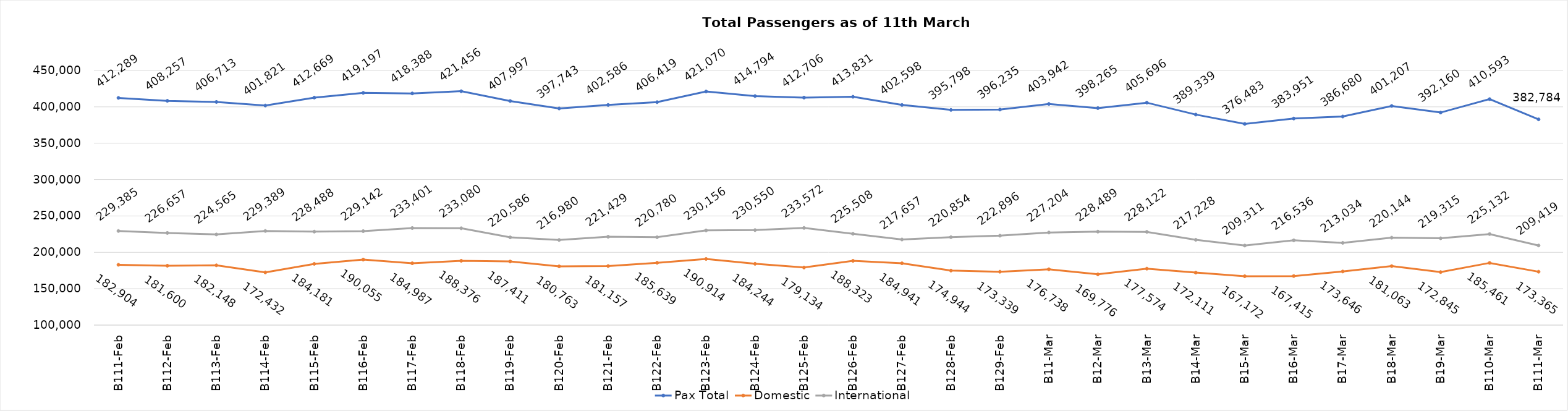
| Category | Pax Total | Domestic | International |
|---|---|---|---|
| 2024-02-11 | 412289 | 182904 | 229385 |
| 2024-02-12 | 408257 | 181600 | 226657 |
| 2024-02-13 | 406713 | 182148 | 224565 |
| 2024-02-14 | 401821 | 172432 | 229389 |
| 2024-02-15 | 412669 | 184181 | 228488 |
| 2024-02-16 | 419197 | 190055 | 229142 |
| 2024-02-17 | 418388 | 184987 | 233401 |
| 2024-02-18 | 421456 | 188376 | 233080 |
| 2024-02-19 | 407997 | 187411 | 220586 |
| 2024-02-20 | 397743 | 180763 | 216980 |
| 2024-02-21 | 402586 | 181157 | 221429 |
| 2024-02-22 | 406419 | 185639 | 220780 |
| 2024-02-23 | 421070 | 190914 | 230156 |
| 2024-02-24 | 414794 | 184244 | 230550 |
| 2024-02-25 | 412706 | 179134 | 233572 |
| 2024-02-26 | 413831 | 188323 | 225508 |
| 2024-02-27 | 402598 | 184941 | 217657 |
| 2024-02-28 | 395798 | 174944 | 220854 |
| 2024-02-29 | 396235 | 173339 | 222896 |
| 2024-03-01 | 403942 | 176738 | 227204 |
| 2024-03-02 | 398265 | 169776 | 228489 |
| 2024-03-03 | 405696 | 177574 | 228122 |
| 2024-03-04 | 389339 | 172111 | 217228 |
| 2024-03-05 | 376483 | 167172 | 209311 |
| 2024-03-06 | 383951 | 167415 | 216536 |
| 2024-03-07 | 386680 | 173646 | 213034 |
| 2024-03-08 | 401207 | 181063 | 220144 |
| 2024-03-09 | 392160 | 172845 | 219315 |
| 2024-03-10 | 410593 | 185461 | 225132 |
| 2024-03-11 | 382784 | 173365 | 209419 |